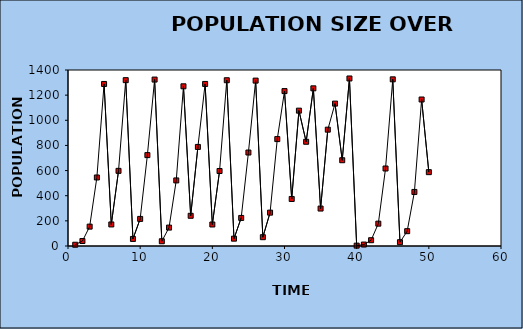
| Category | Series 0 |
|---|---|
| 1.0 | 10 |
| 2.0 | 39.7 |
| 3.0 | 154.072 |
| 4.0 | 545.073 |
| 5.0 | 1288.978 |
| 6.0 | 171.519 |
| 7.0 | 597.82 |
| 8.0 | 1319.114 |
| 9.0 | 56.272 |
| 10.0 | 215.587 |
| 11.0 | 722.914 |
| 12.0 | 1323.842 |
| 13.0 | 37.695 |
| 14.0 | 146.518 |
| 15.0 | 521.671 |
| 16.0 | 1270.262 |
| 17.0 | 240.352 |
| 18.0 | 788.101 |
| 19.0 | 1289.094 |
| 20.0 | 171.085 |
| 21.0 | 596.529 |
| 22.0 | 1318.576 |
| 23.0 | 58.378 |
| 24.0 | 223.287 |
| 25.0 | 743.576 |
| 26.0 | 1315.588 |
| 27.0 | 70.035 |
| 28.0 | 265.426 |
| 29.0 | 850.352 |
| 30.0 | 1232.112 |
| 31.0 | 374.146 |
| 32.0 | 1076.629 |
| 33.0 | 829.126 |
| 34.0 | 1254.155 |
| 35.0 | 297.907 |
| 36.0 | 925.382 |
| 37.0 | 1132.532 |
| 38.0 | 682.241 |
| 39.0 | 1332.606 |
| 40.0 | 2.909 |
| 41.0 | 11.612 |
| 42.0 | 46.042 |
| 43.0 | 177.808 |
| 44.0 | 616.386 |
| 45.0 | 1325.749 |
| 46.0 | 30.165 |
| 47.0 | 117.931 |
| 48.0 | 430 |
| 49.0 | 1165.3 |
| 50.0 | 587.428 |